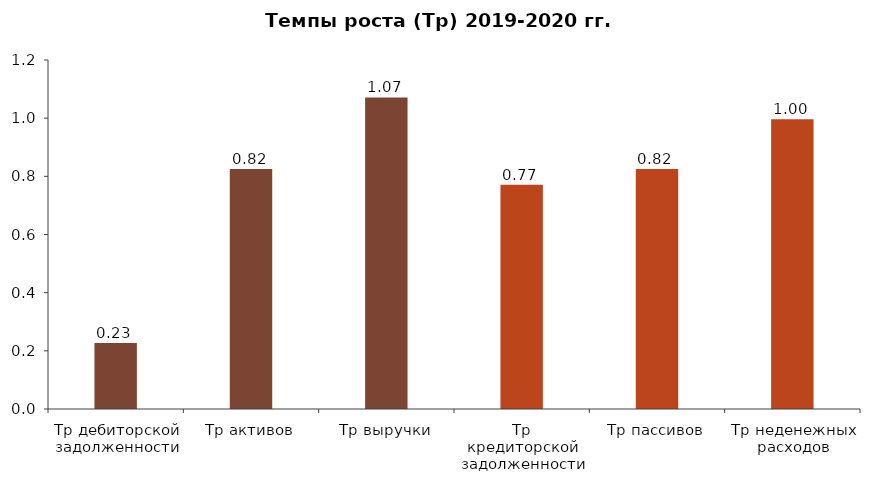
| Category | Series 0 |
|---|---|
| Тр дебиторской задолженности | 0.227 |
| Тр активов | 0.825 |
| Тр выручки | 1.071 |
| Тр кредиторской задолженности | 0.771 |
| Тр пассивов | 0.825 |
| Тр неденежных расходов | 0.996 |